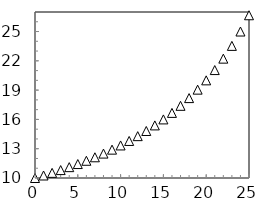
| Category | Series 2 |
|---|---|
| 0.0 | 10 |
| 1.0 | 10.256 |
| 2.0 | 10.526 |
| 3.0 | 10.811 |
| 4.0 | 11.111 |
| 5.0 | 11.429 |
| 6.0 | 11.765 |
| 7.0 | 12.121 |
| 8.0 | 12.5 |
| 9.0 | 12.903 |
| 10.0 | 13.333 |
| 11.0 | 13.793 |
| 12.0 | 14.286 |
| 13.0 | 14.815 |
| 14.0 | 15.385 |
| 15.0 | 16 |
| 16.0 | 16.667 |
| 17.0 | 17.391 |
| 18.0 | 18.182 |
| 19.0 | 19.048 |
| 20.0 | 20 |
| 21.0 | 21.053 |
| 22.0 | 22.222 |
| 23.0 | 23.529 |
| 24.0 | 25 |
| 25.0 | 26.667 |